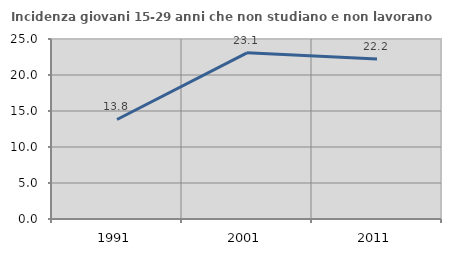
| Category | Incidenza giovani 15-29 anni che non studiano e non lavorano  |
|---|---|
| 1991.0 | 13.82 |
| 2001.0 | 23.077 |
| 2011.0 | 22.222 |